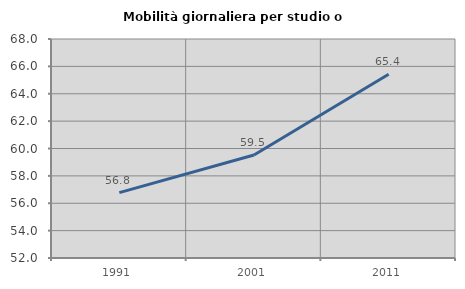
| Category | Mobilità giornaliera per studio o lavoro |
|---|---|
| 1991.0 | 56.778 |
| 2001.0 | 59.53 |
| 2011.0 | 65.425 |